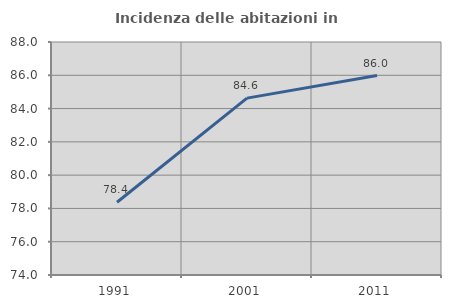
| Category | Incidenza delle abitazioni in proprietà  |
|---|---|
| 1991.0 | 78.372 |
| 2001.0 | 84.629 |
| 2011.0 | 85.983 |